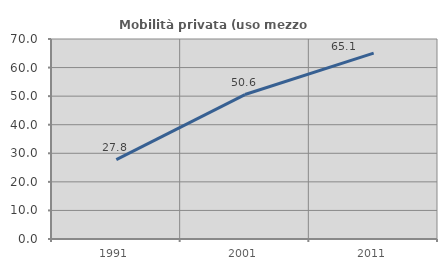
| Category | Mobilità privata (uso mezzo privato) |
|---|---|
| 1991.0 | 27.769 |
| 2001.0 | 50.559 |
| 2011.0 | 65.063 |